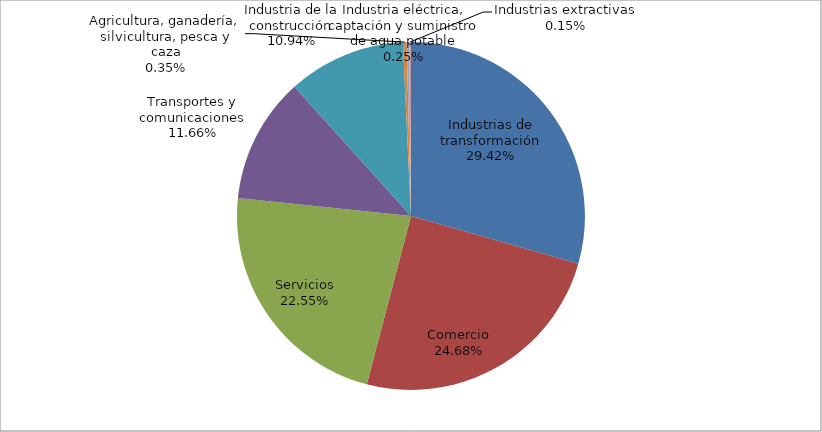
| Category | Series 0 |
|---|---|
| Industrias de transformación | 30861 |
| Comercio | 25889 |
| Servicios | 23662 |
| Transportes y comunicaciones | 12238 |
| Industria de la construcción | 11481 |
| Agricultura, ganadería, silvicultura, pesca y caza | 365 |
| Industria eléctrica, captación y suministro de agua potable | 261 |
| Industrias extractivas | 156 |